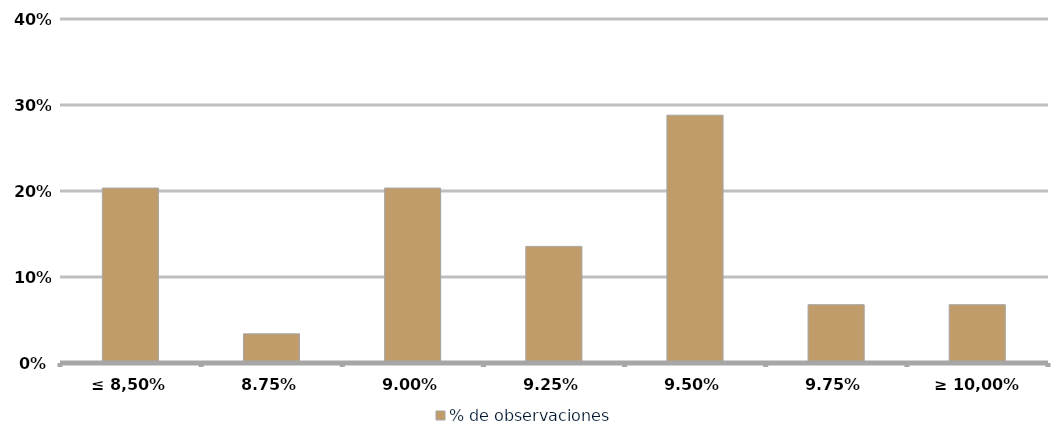
| Category | % de observaciones  |
|---|---|
| ≤ 8,50% | 0.203 |
| 8,75% | 0.034 |
| 9,00% | 0.203 |
| 9,25% | 0.136 |
| 9,50% | 0.288 |
| 9,75% | 0.068 |
| ≥ 10,00% | 0.068 |